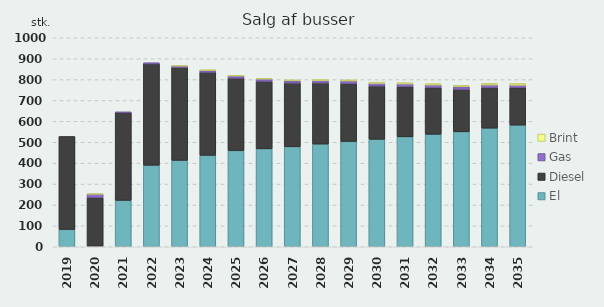
| Category | El | Diesel | Gas | Brint |
|---|---|---|---|---|
| 2019 | 83 | 445 | 0 | 0 |
| 2020 | 3 | 233 | 16 | 3 |
| 2021 | 222 | 421 | 1 | 0 |
| 2022 | 390.32 | 484.69 | 5.69 | 0 |
| 2023 | 413.57 | 444.61 | 7.25 | 1.12 |
| 2024 | 437.42 | 397.86 | 8.79 | 2.16 |
| 2025 | 460.19 | 346.79 | 10.29 | 3.06 |
| 2026 | 468.87 | 323.09 | 10.67 | 3.58 |
| 2027 | 478.89 | 304.69 | 11.07 | 4.14 |
| 2028 | 491.48 | 292.43 | 11.51 | 4.79 |
| 2029 | 504.03 | 277.48 | 11.96 | 5.41 |
| 2030 | 514.4 | 255.19 | 12.38 | 5.85 |
| 2031 | 526.34 | 240.29 | 12.32 | 6.43 |
| 2032 | 538.48 | 223.24 | 12.29 | 6.94 |
| 2033 | 550.46 | 202.84 | 12.29 | 7.31 |
| 2034 | 567.79 | 194.04 | 12.32 | 8.1 |
| 2035 | 582.31 | 178.61 | 12.35 | 8.64 |